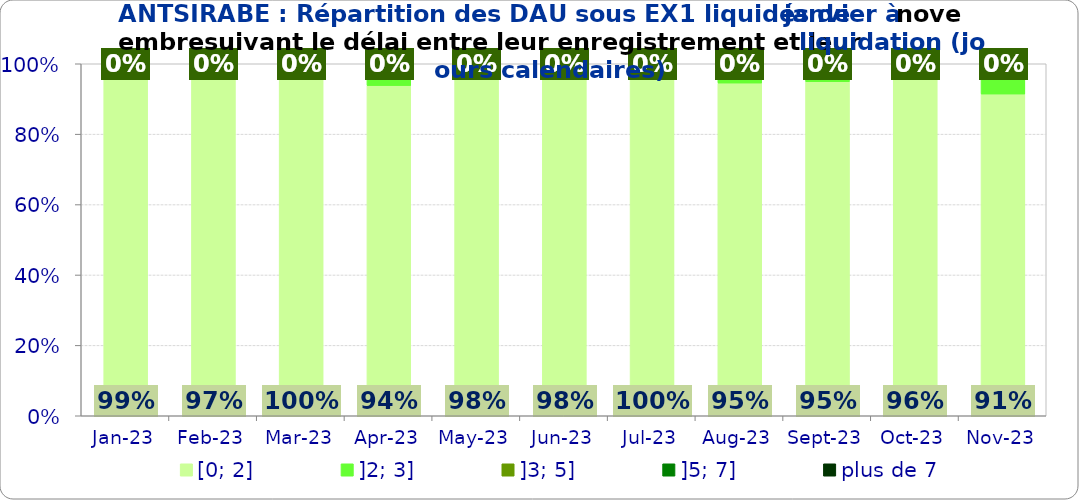
| Category | [0; 2] | ]2; 3] | ]3; 5] | ]5; 7] | plus de 7 |
|---|---|---|---|---|---|
| 2023-01-01 | 0.994 | 0 | 0.006 | 0 | 0 |
| 2023-02-01 | 0.97 | 0.03 | 0 | 0 | 0 |
| 2023-03-01 | 1 | 0 | 0 | 0 | 0 |
| 2023-04-01 | 0.938 | 0.062 | 0 | 0 | 0 |
| 2023-05-01 | 0.981 | 0.006 | 0.013 | 0 | 0 |
| 2023-06-01 | 0.98 | 0.02 | 0 | 0 | 0 |
| 2023-07-01 | 1 | 0 | 0 | 0 | 0 |
| 2023-08-01 | 0.945 | 0.055 | 0 | 0 | 0 |
| 2023-09-01 | 0.949 | 0.051 | 0 | 0 | 0 |
| 2023-10-01 | 0.957 | 0.034 | 0.009 | 0 | 0 |
| 2023-11-01 | 0.914 | 0.07 | 0.016 | 0 | 0 |